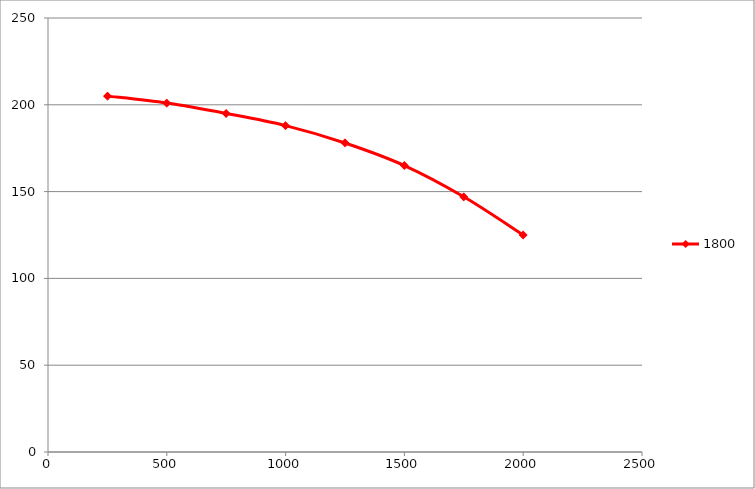
| Category | 1800 |
|---|---|
| 250.0 | 205 |
| 500.0 | 201 |
| 750.0 | 195 |
| 1000.0 | 188 |
| 1250.0 | 178 |
| 1500.0 | 165 |
| 1750.0 | 147 |
| 2000.0 | 125 |